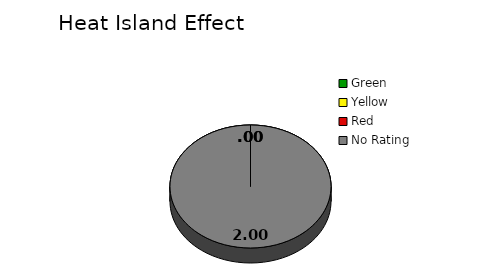
| Category | Counts |
|---|---|
| Green | 0 |
| Yellow | 0 |
| Red | 0 |
| No Rating | 2 |